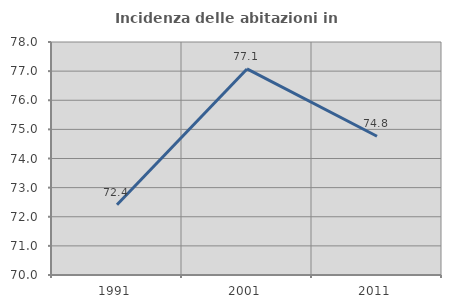
| Category | Incidenza delle abitazioni in proprietà  |
|---|---|
| 1991.0 | 72.414 |
| 2001.0 | 77.075 |
| 2011.0 | 74.765 |